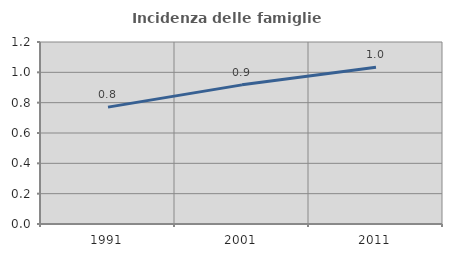
| Category | Incidenza delle famiglie numerose |
|---|---|
| 1991.0 | 0.771 |
| 2001.0 | 0.917 |
| 2011.0 | 1.034 |